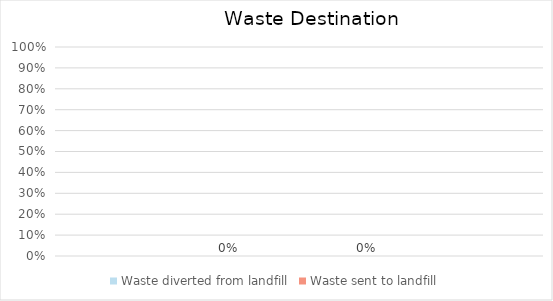
| Category | Waste Costs |
|---|---|
| Reuse | 0 |
| Recycle | 0 |
| Recover for energy | 0 |
| Treat/Dispose | 0 |